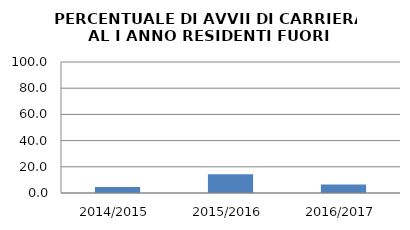
| Category | 2014/2015 2015/2016 2016/2017 |
|---|---|
| 2014/2015 | 4.651 |
| 2015/2016 | 14.286 |
| 2016/2017 | 6.452 |